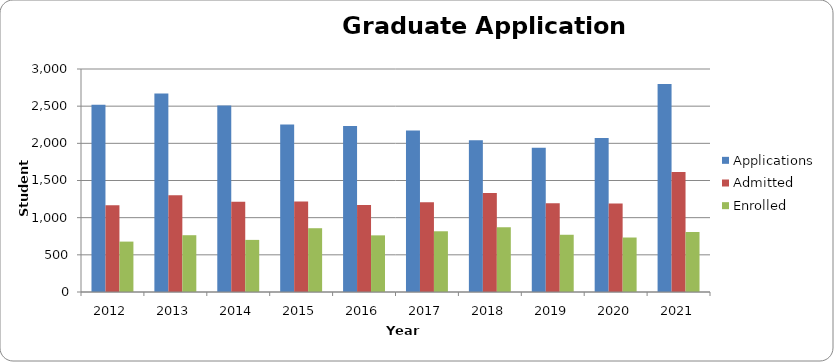
| Category | Applications | Admitted | Enrolled |
|---|---|---|---|
| 2012.0 | 2518 | 1167 | 678 |
| 2013.0 | 2672 | 1303 | 764 |
| 2014.0 | 2509 | 1214 | 701 |
| 2015.0 | 2255 | 1218 | 858 |
| 2016.0 | 2233 | 1169 | 762 |
| 2017.0 | 2172 | 1207 | 817 |
| 2018.0 | 2040 | 1333 | 872 |
| 2019.0 | 1942 | 1193 | 770 |
| 2020.0 | 2073 | 1189 | 733 |
| 2021.0 | 2799 | 1616 | 807 |